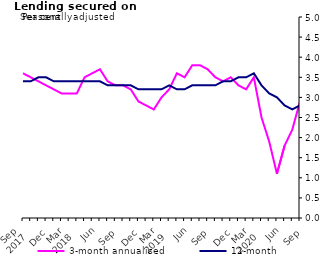
| Category | 3-month annualised | 12-month |
|---|---|---|
| Sep 
2017 | 3.6 | 3.4 |
|  | 3.5 | 3.4 |
|  | 3.4 | 3.5 |
| Dec | 3.3 | 3.5 |
|  | 3.2 | 3.4 |
|  | 3.1 | 3.4 |
| Mar 
2018 | 3.1 | 3.4 |
|  | 3.1 | 3.4 |
|  | 3.5 | 3.4 |
| Jun | 3.6 | 3.4 |
|  | 3.7 | 3.4 |
|  | 3.4 | 3.3 |
| Sep | 3.3 | 3.3 |
|  | 3.3 | 3.3 |
|  | 3.2 | 3.3 |
| Dec | 2.9 | 3.2 |
|  | 2.8 | 3.2 |
|  | 2.7 | 3.2 |
| Mar 
2019 | 3 | 3.2 |
|  | 3.2 | 3.3 |
|  | 3.6 | 3.2 |
| Jun | 3.5 | 3.2 |
|  | 3.8 | 3.3 |
|  | 3.8 | 3.3 |
| Sep | 3.7 | 3.3 |
|  | 3.5 | 3.3 |
|  | 3.4 | 3.4 |
| Dec | 3.5 | 3.4 |
|  | 3.3 | 3.5 |
|  | 3.2 | 3.5 |
| Mar 
2020 | 3.5 | 3.6 |
|  | 2.5 | 3.3 |
|  | 1.9 | 3.1 |
| Jun | 1.1 | 3 |
|  | 1.8 | 2.8 |
|  | 2.2 | 2.7 |
| Sep | 2.9 | 2.8 |